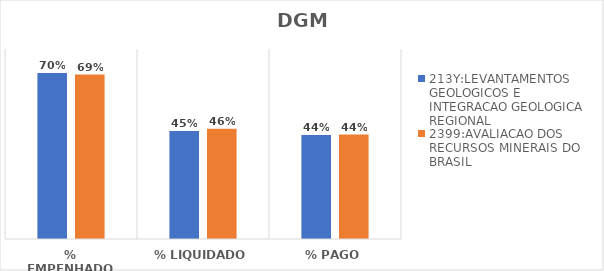
| Category | 213Y:LEVANTAMENTOS GEOLOGICOS E INTEGRACAO GEOLOGICA REGIONAL | 2399:AVALIACAO DOS RECURSOS MINERAIS DO BRASIL |
|---|---|---|
| % EMPENHADO | 0.699 | 0.692 |
| % LIQUIDADO | 0.455 | 0.464 |
| % PAGO | 0.438 | 0.44 |